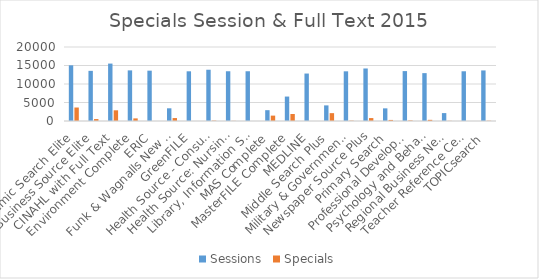
| Category | Sessions | Specials |
|---|---|---|
| Academic Search Elite | 15048 | 3644 |
| Business Source Elite | 13554 | 526 |
| CINAHL with Full Text | 15519 | 2891 |
| Environment Complete | 13682 | 705 |
| ERIC | 13605 | 0 |
| Funk & Wagnalls New World Encyclopedia | 3432 | 797 |
| GreenFILE | 13434 | 0 |
| Health Source - Consumer Edition | 13855 | 103 |
| Health Source: Nursing/Academic Edition | 13446 | 40 |
| Library, Information Science & Technology Abstracts | 13447 | 0 |
| MAS Complete | 2924 | 1455 |
| MasterFILE Complete | 6606 | 1896 |
| MEDLINE | 12826 | 0 |
| Middle Search Plus | 4220 | 2122 |
| Military & Government Collection | 13427 | 96 |
| Newspaper Source Plus | 14194 | 790 |
| Primary Search | 3418 | 288 |
| Professional Development Collection | 13488 | 148 |
| Psychology and Behavioral Sciences Collection | 12937 | 313 |
| Regional Business News | 2136 | 43 |
| Teacher Reference Center | 13439 | 0 |
| TOPICsearch | 13668 | 67 |